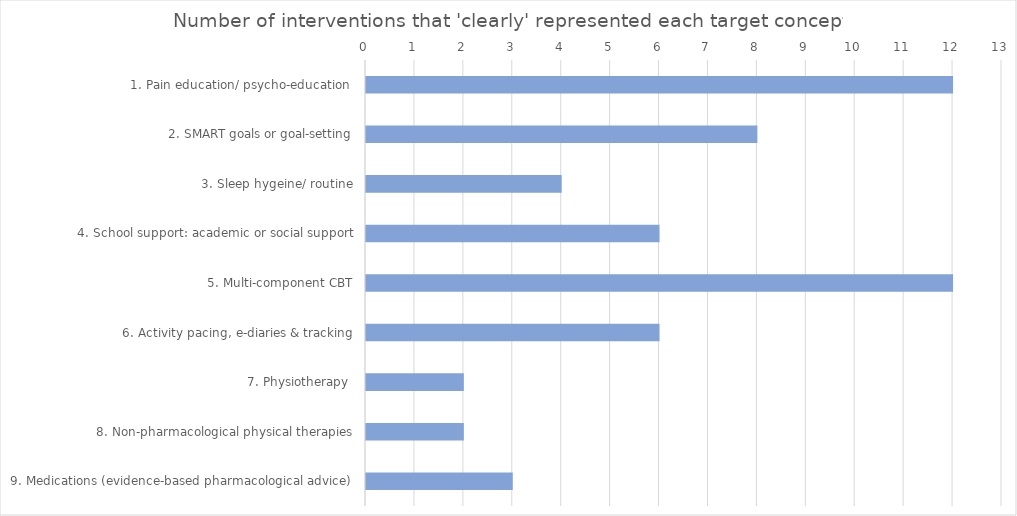
| Category | Series 0 |
|---|---|
| 1. Pain education/ psycho-education  | 12 |
| 2. SMART goals or goal-setting | 8 |
| 3. Sleep hygeine/ routine | 4 |
| 4. School support: academic or social support | 6 |
| 5. Multi-component CBT | 12 |
| 6. Activity pacing, e-diaries & tracking | 6 |
| 7. Physiotherapy  | 2 |
| 8. Non-pharmacological physical therapies | 2 |
| 9. Medications (evidence-based pharmacological advice) | 3 |